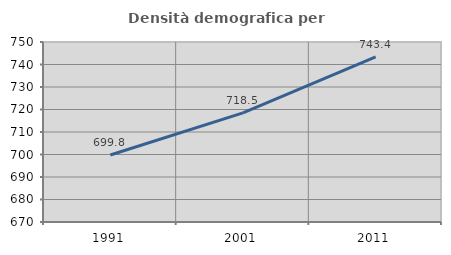
| Category | Densità demografica |
|---|---|
| 1991.0 | 699.792 |
| 2001.0 | 718.511 |
| 2011.0 | 743.367 |